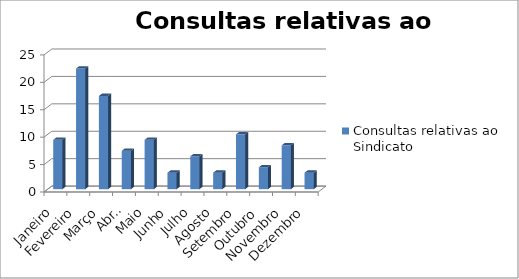
| Category | Consultas relativas ao Sindicato |
|---|---|
| Janeiro | 9 |
| Fevereiro | 22 |
| Março | 17 |
| Abril | 7 |
| Maio | 9 |
| Junho | 3 |
| Julho | 6 |
| Agosto | 3 |
| Setembro | 10 |
| Outubro | 4 |
| Novembro | 8 |
| Dezembro | 3 |